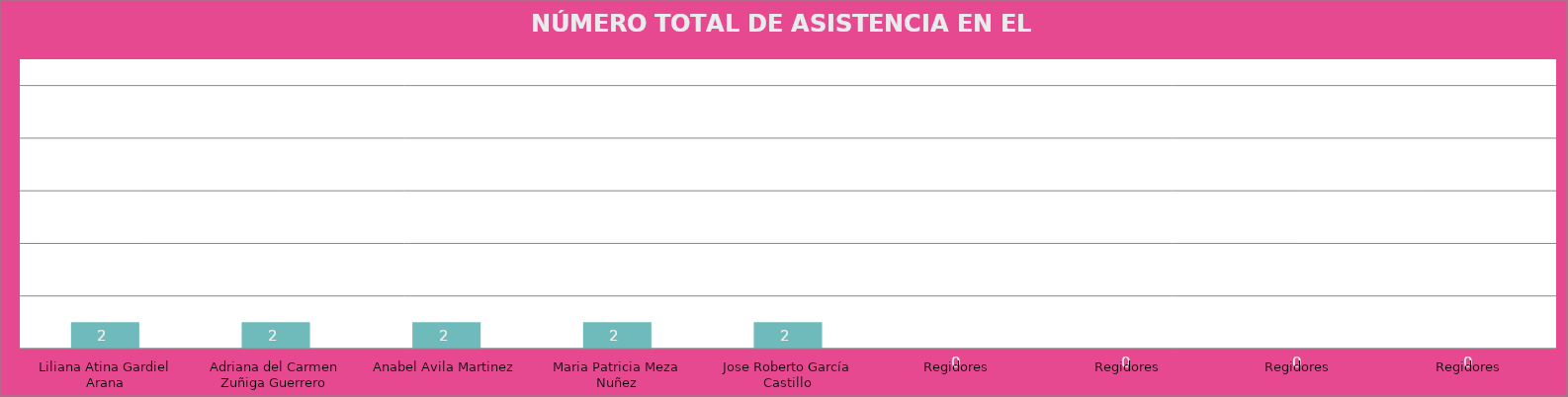
| Category | Liliana Atina Gardiel Arana |
|---|---|
| Liliana Atina Gardiel Arana | 2 |
| Adriana del Carmen Zuñiga Guerrero | 2 |
| Anabel Avila Martinez | 2 |
| Maria Patricia Meza Nuñez | 2 |
| Jose Roberto García Castillo | 2 |
| Regidores | 0 |
| Regidores | 0 |
| Regidores | 0 |
| Regidores | 0 |